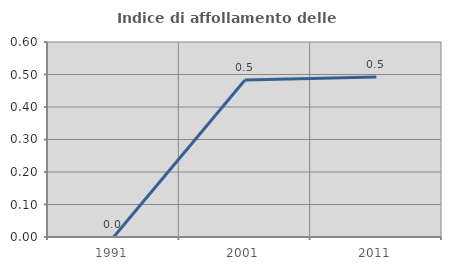
| Category | Indice di affollamento delle abitazioni  |
|---|---|
| 1991.0 | 0 |
| 2001.0 | 0.483 |
| 2011.0 | 0.493 |